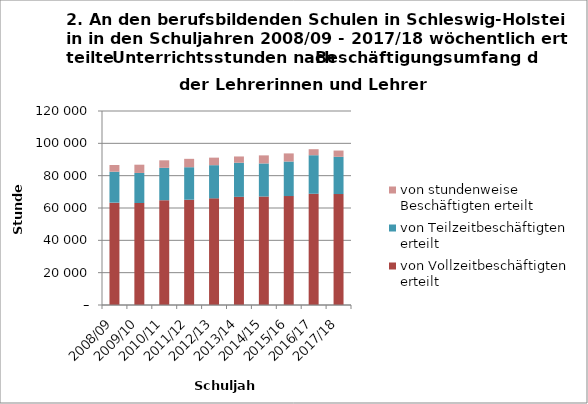
| Category | von Vollzeitbeschäftigten erteilt | von Teilzeitbeschäftigten erteilt | von stundenweise Beschäftigten erteilt |
|---|---|---|---|
| 2008/09 | 63318 | 19143 | 4127 |
| 2009/10 | 63082 | 18601 | 5100 |
| 2010/11 | 64821 | 20032 | 4645 |
| 2011/12 | 65119 | 20107 | 5192 |
| 2012/13 | 65972 | 20520 | 4659 |
| 2013/14 | 66913 | 21100 | 3862 |
| 2014/15 | 67101.5 | 20464.1 | 4987.2 |
| 2015/16 | 67369.2 | 21390.4 | 5010.3 |
| 2016/17 | 68815.6 | 23834.2 | 3717.5 |
| 2017/18 | 68624.2 | 23041.9 | 3865.9 |